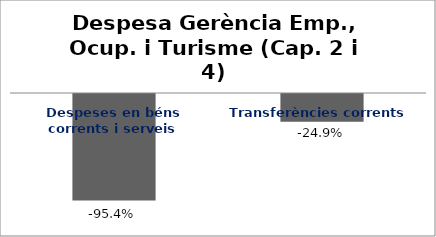
| Category | Series 0 |
|---|---|
| Despeses en béns corrents i serveis | -0.954 |
| Transferències corrents | -0.249 |